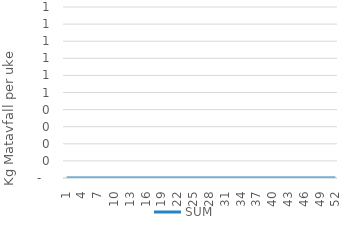
| Category | SUM |
|---|---|
| 1.0 | 0 |
| 2.0 | 0 |
| 3.0 | 0 |
| 4.0 | 0 |
| 5.0 | 0 |
| 6.0 | 0 |
| 7.0 | 0 |
| 8.0 | 0 |
| 9.0 | 0 |
| 10.0 | 0 |
| 11.0 | 0 |
| 12.0 | 0 |
| 13.0 | 0 |
| 14.0 | 0 |
| 15.0 | 0 |
| 16.0 | 0 |
| 17.0 | 0 |
| 18.0 | 0 |
| 19.0 | 0 |
| 20.0 | 0 |
| 21.0 | 0 |
| 22.0 | 0 |
| 23.0 | 0 |
| 24.0 | 0 |
| 25.0 | 0 |
| 26.0 | 0 |
| 27.0 | 0 |
| 28.0 | 0 |
| 29.0 | 0 |
| 30.0 | 0 |
| 31.0 | 0 |
| 32.0 | 0 |
| 33.0 | 0 |
| 34.0 | 0 |
| 35.0 | 0 |
| 36.0 | 0 |
| 37.0 | 0 |
| 38.0 | 0 |
| 39.0 | 0 |
| 40.0 | 0 |
| 41.0 | 0 |
| 42.0 | 0 |
| 43.0 | 0 |
| 44.0 | 0 |
| 45.0 | 0 |
| 46.0 | 0 |
| 47.0 | 0 |
| 48.0 | 0 |
| 49.0 | 0 |
| 50.0 | 0 |
| 51.0 | 0 |
| 52.0 | 0 |